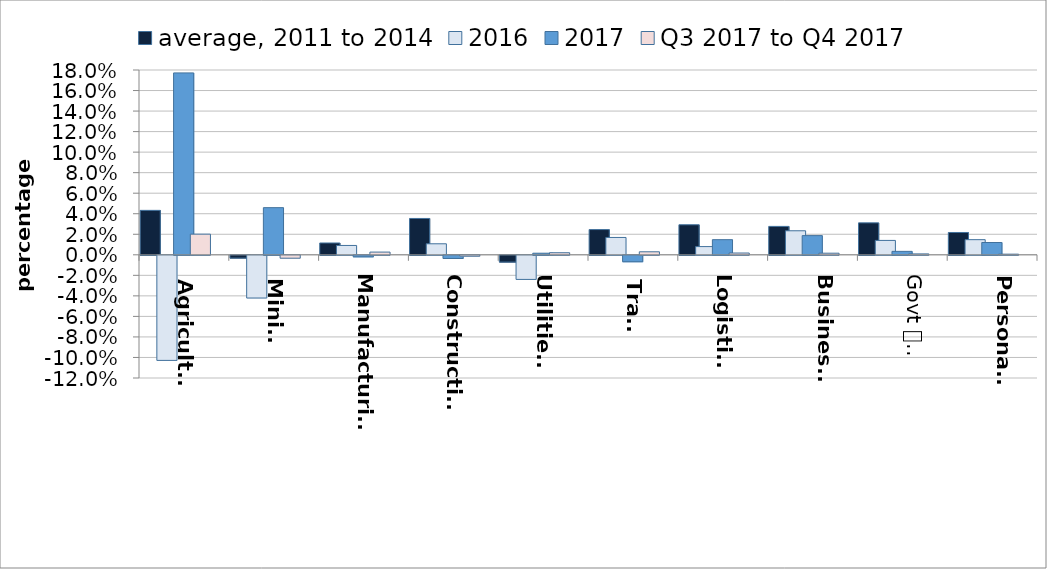
| Category | average, 2011 to 2014 | 2016 | 2017 | Q3 2017 to Q4 2017 | Series 4 |
|---|---|---|---|---|---|
| Agriculture | 0.043 | -0.102 | 0.177 | 0.02 |  |
| Mining | -0.003 | -0.042 | 0.046 | -0.003 |  |
| Manufacturing | 0.012 | 0.009 | -0.002 | 0.003 |  |
| Construction | 0.035 | 0.011 | -0.003 | -0.001 |  |
| Utilities
 | -0.007 | -0.023 | 0.002 | 0.002 |  |
| Trade | 0.025 | 0.017 | -0.006 | 0.003 |  |
| Logistics | 0.029 | 0.008 | 0.015 | 0.002 |  |
| Business
services | 0.028 | 0.023 | 0.019 | 0.002 |  |
| Govt 
services | 0.031 | 0.014 | 0.003 | 0.001 |  |
| Personal 
Sevices | 0.022 | 0.015 | 0.012 | 0.001 |  |